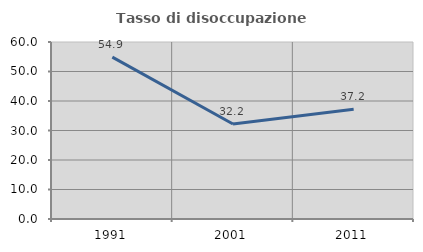
| Category | Tasso di disoccupazione giovanile  |
|---|---|
| 1991.0 | 54.861 |
| 2001.0 | 32.203 |
| 2011.0 | 37.209 |